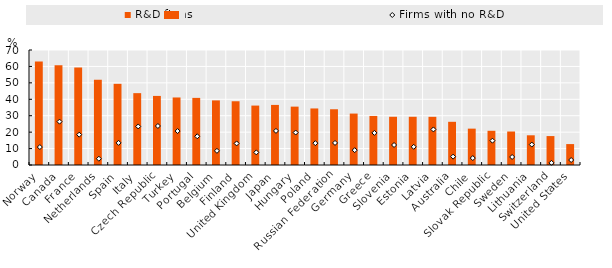
| Category | R&D firms |
|---|---|
| Norway | 62.98 |
| Canada | 60.669 |
| France | 59.305 |
| Netherlands | 51.862 |
| Spain | 49.412 |
| Italy | 43.736 |
| Czech Republic | 42.05 |
| Turkey | 41.106 |
| Portugal | 40.851 |
| Belgium | 39.319 |
| Finland | 38.801 |
| United Kingdom | 36.173 |
| Japan | 36.571 |
| Hungary | 35.532 |
| Poland | 34.422 |
| Russian Federation | 33.931 |
| Germany | 31.304 |
| Greece | 29.861 |
| Slovenia | 29.364 |
| Estonia | 29.36 |
| Latvia | 29.327 |
| Australia | 26.291 |
| Chile | 22.13 |
| Slovak Republic | 20.823 |
| Sweden | 20.386 |
| Lithuania | 18.08 |
| Switzerland | 17.61 |
| United States | 12.733 |